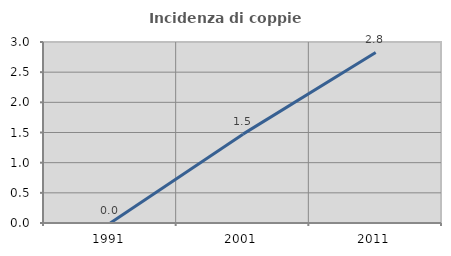
| Category | Incidenza di coppie miste |
|---|---|
| 1991.0 | 0 |
| 2001.0 | 1.473 |
| 2011.0 | 2.827 |